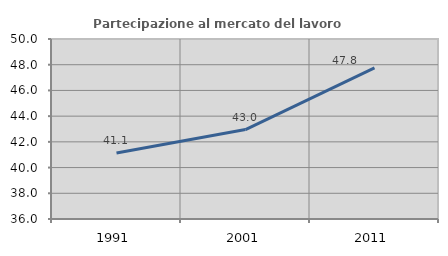
| Category | Partecipazione al mercato del lavoro  femminile |
|---|---|
| 1991.0 | 41.135 |
| 2001.0 | 42.956 |
| 2011.0 | 47.753 |